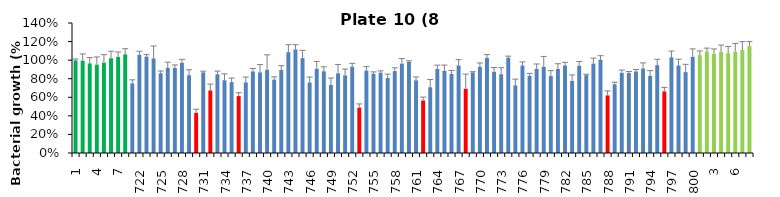
| Category | 8 h % |
|---|---|
| 1.0 | 0.998 |
| 2.0 | 0.994 |
| 3.0 | 0.965 |
| 4.0 | 0.951 |
| 5.0 | 0.973 |
| 6.0 | 1.02 |
| 7.0 | 1.036 |
| 8.0 | 1.063 |
| 721.0 | 0.75 |
| 722.0 | 1.057 |
| 723.0 | 1.038 |
| 724.0 | 1.018 |
| 725.0 | 0.859 |
| 726.0 | 0.918 |
| 727.0 | 0.915 |
| 728.0 | 0.971 |
| 729.0 | 0.838 |
| 730.0 | 0.432 |
| 731.0 | 0.868 |
| 732.0 | 0.673 |
| 733.0 | 0.848 |
| 734.0 | 0.784 |
| 735.0 | 0.763 |
| 736.0 | 0.613 |
| 737.0 | 0.76 |
| 738.0 | 0.878 |
| 739.0 | 0.868 |
| 740.0 | 0.897 |
| 741.0 | 0.79 |
| 742.0 | 0.895 |
| 743.0 | 1.086 |
| 744.0 | 1.115 |
| 745.0 | 1.022 |
| 746.0 | 0.759 |
| 747.0 | 0.908 |
| 748.0 | 0.88 |
| 749.0 | 0.732 |
| 750.0 | 0.858 |
| 751.0 | 0.836 |
| 752.0 | 0.929 |
| 753.0 | 0.488 |
| 754.0 | 0.888 |
| 755.0 | 0.854 |
| 756.0 | 0.866 |
| 757.0 | 0.807 |
| 758.0 | 0.882 |
| 759.0 | 0.962 |
| 760.0 | 0.981 |
| 761.0 | 0.782 |
| 762.0 | 0.565 |
| 763.0 | 0.708 |
| 764.0 | 0.905 |
| 765.0 | 0.885 |
| 766.0 | 0.851 |
| 767.0 | 0.943 |
| 768.0 | 0.691 |
| 769.0 | 0.868 |
| 770.0 | 0.928 |
| 771.0 | 1.025 |
| 772.0 | 0.875 |
| 773.0 | 0.848 |
| 774.0 | 1.026 |
| 775.0 | 0.728 |
| 776.0 | 0.942 |
| 777.0 | 0.831 |
| 778.0 | 0.906 |
| 779.0 | 0.929 |
| 780.0 | 0.828 |
| 781.0 | 0.904 |
| 782.0 | 0.943 |
| 783.0 | 0.776 |
| 784.0 | 0.939 |
| 785.0 | 0.839 |
| 786.0 | 0.962 |
| 787.0 | 1.004 |
| 788.0 | 0.62 |
| 789.0 | 0.74 |
| 790.0 | 0.863 |
| 791.0 | 0.861 |
| 792.0 | 0.878 |
| 793.0 | 0.91 |
| 794.0 | 0.83 |
| 795.0 | 0.946 |
| 796.0 | 0.663 |
| 797.0 | 1.03 |
| 798.0 | 0.942 |
| 799.0 | 0.871 |
| 800.0 | 1.035 |
| 1.0 | 1.054 |
| 2.0 | 1.093 |
| 3.0 | 1.069 |
| 4.0 | 1.09 |
| 5.0 | 1.075 |
| 6.0 | 1.091 |
| 7.0 | 1.11 |
| 8.0 | 1.151 |